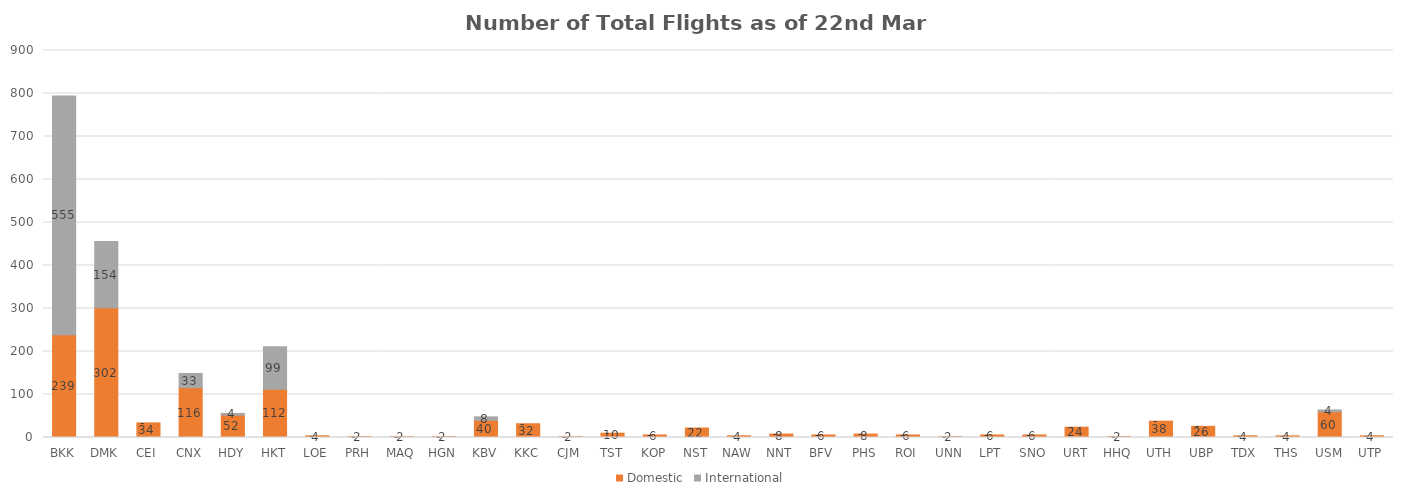
| Category | Domestic | International |
|---|---|---|
| BKK | 239 | 555 |
| DMK | 302 | 154 |
| CEI | 34 | 0 |
| CNX | 116 | 33 |
| HDY | 52 | 4 |
| HKT | 112 | 99 |
| LOE | 4 | 0 |
| PRH | 2 | 0 |
| MAQ | 2 | 0 |
| HGN | 2 | 0 |
| KBV | 40 | 8 |
| KKC | 32 | 0 |
| CJM | 2 | 0 |
| TST | 10 | 0 |
| KOP | 6 | 0 |
| NST | 22 | 0 |
| NAW | 4 | 0 |
| NNT | 8 | 0 |
| BFV | 6 | 0 |
| PHS | 8 | 0 |
| ROI | 6 | 0 |
| UNN | 2 | 0 |
| LPT | 6 | 0 |
| SNO | 6 | 0 |
| URT | 24 | 0 |
| HHQ | 2 | 0 |
| UTH | 38 | 0 |
| UBP | 26 | 0 |
| TDX | 4 | 0 |
| THS | 4 | 0 |
| USM | 60 | 4 |
| UTP | 4 | 0 |